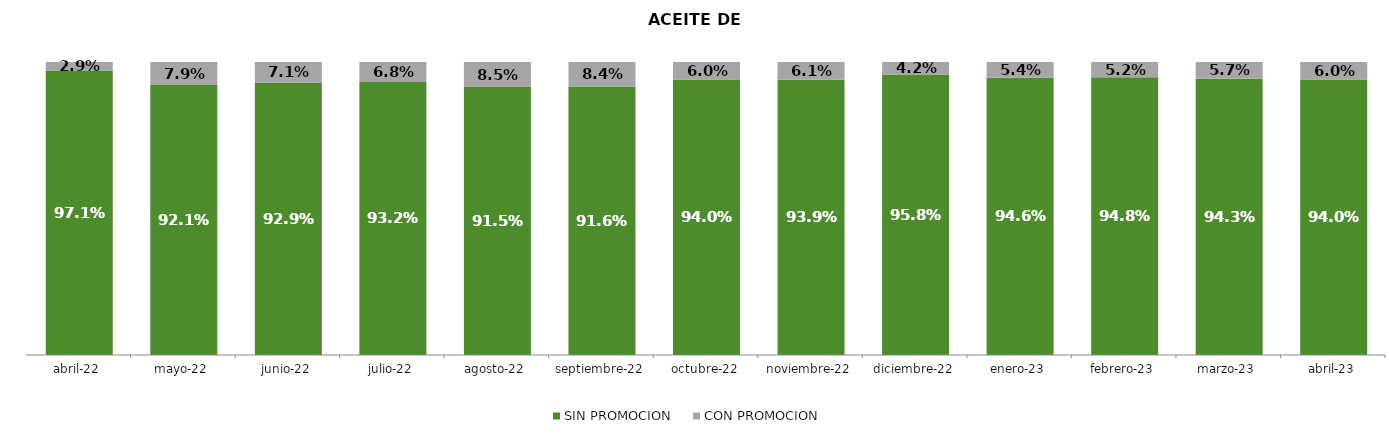
| Category | SIN PROMOCION   | CON PROMOCION   |
|---|---|---|
| 2022-04-01 | 0.971 | 0.029 |
| 2022-05-01 | 0.921 | 0.079 |
| 2022-06-01 | 0.929 | 0.071 |
| 2022-07-01 | 0.932 | 0.068 |
| 2022-08-01 | 0.915 | 0.085 |
| 2022-09-01 | 0.916 | 0.084 |
| 2022-10-01 | 0.94 | 0.06 |
| 2022-11-01 | 0.939 | 0.061 |
| 2022-12-01 | 0.958 | 0.042 |
| 2023-01-01 | 0.946 | 0.054 |
| 2023-02-01 | 0.948 | 0.052 |
| 2023-03-01 | 0.943 | 0.057 |
| 2023-04-01 | 0.94 | 0.06 |